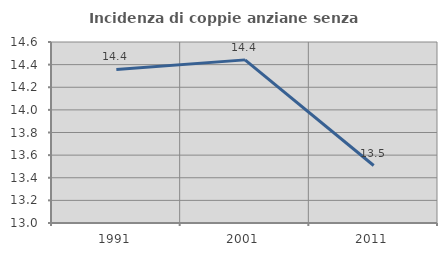
| Category | Incidenza di coppie anziane senza figli  |
|---|---|
| 1991.0 | 14.358 |
| 2001.0 | 14.442 |
| 2011.0 | 13.508 |